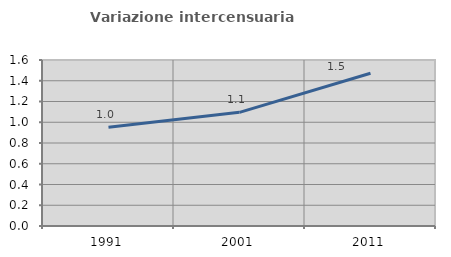
| Category | Variazione intercensuaria annua |
|---|---|
| 1991.0 | 0.952 |
| 2001.0 | 1.096 |
| 2011.0 | 1.473 |